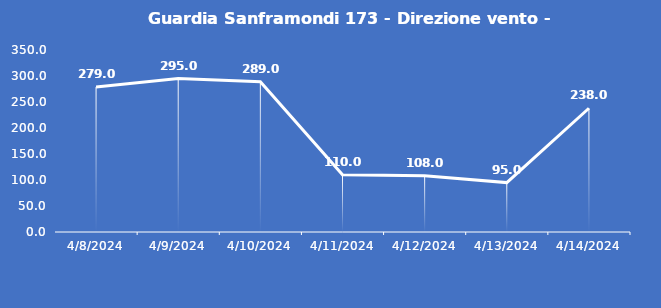
| Category | Guardia Sanframondi 173 - Direzione vento - Grezzo (°N) |
|---|---|
| 4/8/24 | 279 |
| 4/9/24 | 295 |
| 4/10/24 | 289 |
| 4/11/24 | 110 |
| 4/12/24 | 108 |
| 4/13/24 | 95 |
| 4/14/24 | 238 |